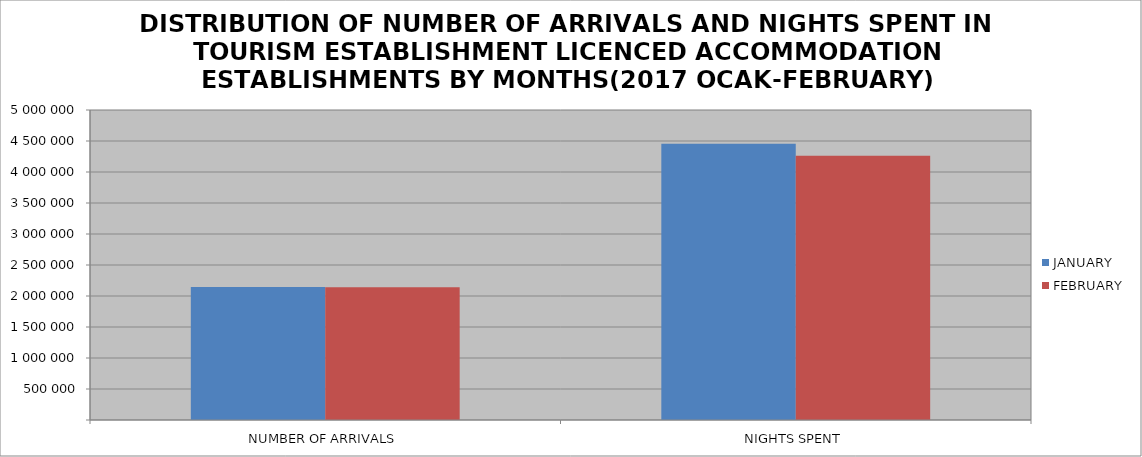
| Category | JANUARY | FEBRUARY |
|---|---|---|
| NUMBER OF ARRIVALS | 2146994 | 2141043 |
| NIGHTS SPENT | 4457352 | 4260377 |